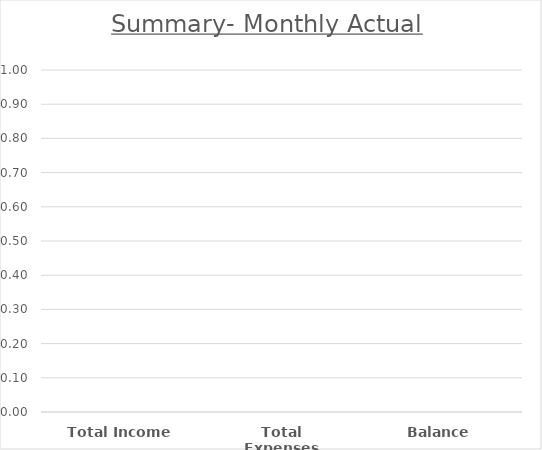
| Category | Actual |
|---|---|
| Total Income | 0 |
| Total Expenses | 0 |
| Balance | 0 |